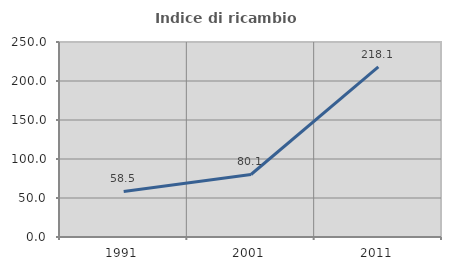
| Category | Indice di ricambio occupazionale  |
|---|---|
| 1991.0 | 58.462 |
| 2001.0 | 80.138 |
| 2011.0 | 218.098 |